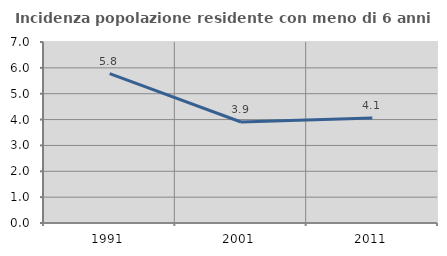
| Category | Incidenza popolazione residente con meno di 6 anni |
|---|---|
| 1991.0 | 5.78 |
| 2001.0 | 3.906 |
| 2011.0 | 4.065 |